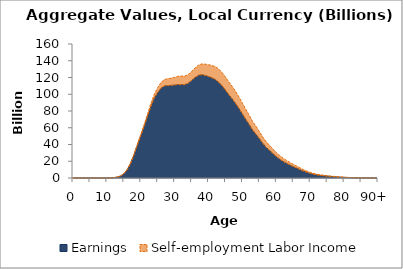
| Category | Earnings | Self-employment Labor Income |
|---|---|---|
| 0 | 0 | 0 |
|  | 0 | 0 |
| 2 | 0 | 0 |
| 3 | 0 | 0 |
| 4 | 0 | 0 |
| 5 | 0 | 0 |
| 6 | 0 | 0 |
| 7 | 0 | 0 |
| 8 | 0 | 0 |
| 9 | 0 | 0 |
| 10 | 0 | 0 |
| 11 | 0 | 0 |
| 12 | 439.696 | 46.356 |
| 13 | 1039.739 | 77.615 |
| 14 | 2295.533 | 134.456 |
| 15 | 4950.3 | 267.753 |
| 16 | 9956.032 | 430.304 |
| 17 | 17420.092 | 642.857 |
| 18 | 27663.936 | 977.326 |
| 19 | 39206.558 | 1388.045 |
| 20 | 50396.218 | 1781.067 |
| 21 | 61658.159 | 2163.015 |
| 22 | 73789.831 | 2683.996 |
| 23 | 85634.238 | 3442.578 |
| 24 | 95663.044 | 4454.632 |
| 25 | 102241.396 | 5770.959 |
| 26 | 107376.999 | 6815.845 |
| 27 | 110044.769 | 7619.849 |
| 28 | 110303.064 | 8168.07 |
| 29 | 110618.617 | 8706.831 |
| 30 | 110953.992 | 9240.19 |
| 31 | 111623.161 | 9812.217 |
| 32 | 111585.912 | 10152.322 |
| 33 | 111462.542 | 10252.202 |
| 34 | 113216.265 | 10391.606 |
| 35 | 116461.989 | 10681.646 |
| 36 | 119985.127 | 11320.823 |
| 37 | 122598.45 | 12130.945 |
| 38 | 123333.716 | 12832.446 |
| 39 | 122493.435 | 13423.285 |
| 40 | 121212.066 | 14049.329 |
| 41 | 119519.055 | 14751.93 |
| 42 | 117583.73 | 15408.712 |
| 43 | 114291.503 | 15855.203 |
| 44 | 110000.155 | 15873.361 |
| 45 | 104913.721 | 15610.525 |
| 46 | 99457.711 | 15236.058 |
| 47 | 94397.786 | 14874.73 |
| 48 | 88963.221 | 14365.91 |
| 49 | 82932.691 | 13618.167 |
| 50 | 76474.115 | 12843.186 |
| 51 | 70034.788 | 11970.063 |
| 52 | 63902.191 | 11100.889 |
| 53 | 57316.129 | 10151.455 |
| 54 | 52329.098 | 9377.456 |
| 55 | 47125.346 | 8464.501 |
| 56 | 41395.441 | 7505.564 |
| 57 | 36645.909 | 6639.692 |
| 58 | 33063.49 | 5994.85 |
| 59 | 29193.836 | 5337.347 |
| 60 | 25613.06 | 4791.814 |
| 61 | 22582.638 | 4273.393 |
| 62 | 19809.827 | 3785.27 |
| 63 | 17650.433 | 3408.948 |
| 64 | 15585.375 | 3042.522 |
| 65 | 13621.089 | 2732.159 |
| 66 | 11886.3 | 2424.001 |
| 67 | 10018.057 | 2108.7 |
| 68 | 8261.944 | 1797.151 |
| 69 | 6791.637 | 1501.78 |
| 70 | 5485.342 | 1238.136 |
| 71 | 4423.548 | 1028.116 |
| 72 | 3662.355 | 876.099 |
| 73 | 3079.149 | 751.257 |
| 74 | 2600.387 | 640.374 |
| 75 | 2193.072 | 545.971 |
| 76 | 1851.789 | 462.27 |
| 77 | 1516.817 | 377.461 |
| 78 | 1229.592 | 300.42 |
| 79 | 956.261 | 229.56 |
| 80 | 742.219 | 173.794 |
| 81 | 601.89 | 129.991 |
| 82 | 455.718 | 91.097 |
| 83 | 313.961 | 56.101 |
| 84 | 199.92 | 28.978 |
| 85 | 126.989 | 10.38 |
| 86 | 63.989 | 0 |
| 87 | 45.982 | 0 |
| 88 | 4.849 | 0 |
| 89 | 0 | 0 |
| 90+ | 0 | 0 |